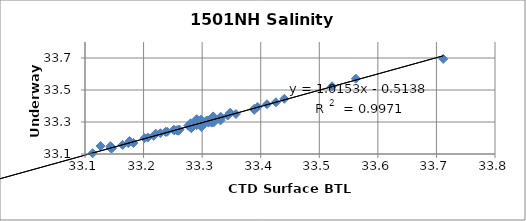
| Category | Salinity  |
|---|---|
| 33.4107 | 33.411 |
| 33.3948 | 33.394 |
| 33.4259 | 33.423 |
| 33.2987 | 33.269 |
| 33.3436 | 33.34 |
| 33.3018 | 33.301 |
| 33.5218 | 33.523 |
| 33.7117 | 33.694 |
| 33.5624 | 33.571 |
| 33.2288 | 33.23 |
| 33.2017 | 33.199 |
| 33.3327 | 33.327 |
| 33.2874 | 33.293 |
| 33.3172 | 33.302 |
| 33.2403 | 33.239 |
| 33.2762 | 33.277 |
| 33.2374 | 33.238 |
| 33.4403 | 33.445 |
| 33.3889 | 33.382 |
| 33.3479 | 33.358 |
| 33.3189 | 33.335 |
| 33.2897 | 33.288 |
| 33.2981 | 33.315 |
| 33.3139 | 33.305 |
| 33.3577 | 33.35 |
| 33.3206 | 33.315 |
| 33.2526 | 33.249 |
| 33.3186 | 33.316 |
| 33.2073 | 33.203 |
| 33.2513 | 33.251 |
| 33.1738 | 33.168 |
| 33.1641 | 33.157 |
| 33.1435 | 33.149 |
| 33.2907 | 33.318 |
| 33.1463 | 33.137 |
| 33.0288 | 33.042 |
| 33.2207 | 33.227 |
| 33.113 | 33.105 |
| 32.9701 | 32.955 |
| 33.1009 | 33.09 |
| 33.1266 | 33.15 |
| 33.1761 | 33.181 |
| 33.2803 | 33.292 |
| 33.3102 | 33.31 |
| 33.2967 | 33.298 |
| 33.3314 | 33.31 |
| 33.3316 | 33.333 |
| 33.3109 | 33.296 |
| 33.3184 | 33.317 |
| 33.3074 | 33.309 |
| 33.2173 | 33.214 |
| 33.2602 | 33.253 |
| 32.8956 | 32.9 |
| 33.1439 | 33.14 |
| 32.8566 | 32.853 |
| 32.9851 | 32.972 |
| 32.8648 | 32.835 |
| 33.2527 | 33.248 |
| 33.31 | 33.31 |
| 33.3201 | 33.299 |
| 33.3164 | 33.296 |
| 33.3002 | 33.275 |
| 33.2815 | 33.261 |
| 33.0909 | 33.073 |
| 33.1828 | 33.169 |
| 32.8381 | 32.823 |
| 32.8606 | 32.835 |
| 32.8724 | 32.858 |
| 32.9007 | 32.886 |
| 32.8187 | 32.82 |
| 33.0036 | 32.996 |
| 33.2907 | 33.28 |
| 33.1447 | 33.135 |
| 33.3889 | 33.376 |
| 33.2807 | 33.268 |
| 33.2595 | 33.245 |
| 32.83 | 32.817 |
| 32.9162 | 32.906 |
| 32.7941 | 32.779 |
| 33.052 | 33.038 |
| 32.9338 | 32.923 |
| 33.2588 | 33.249 |
| 33.2611 | 33.252 |
| 33.2569 | 33.248 |
| 32.6592 | 32.635 |
| 33.059 | 33.051 |